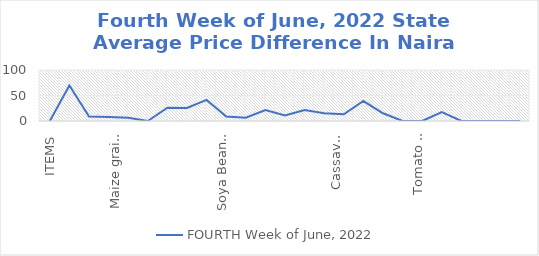
| Category | FOURTH Week of June, 2022 |
|---|---|
| ITEMS | 0 |
| Rice, Imported, High Quality Sold loose  (1 mudu) | 69.565 |
| Rice, Agric Sold Loose(Low quality) imported  (1 mudu) | 8.696 |
| Rice Local, Sold Loose   (1 mudu) | 7.609 |
| Maize grain, white sold loose   (1 mudu) | 6.522 |
| Maize grain, yellow sold loose   (1 mudu) | 0 |
| Sorghum (Guinea Corn) white or brown, sold loose   (1 mudu) | 26.087 |
| millet (jero or maiwa) sold loose   (1 mudu) | 25.652 |
| Beans: white black eye. Sold loose   (1 mudu) | 41.304 |
| Beans Brown, sold loose  (1 mudu) | 8.696 |
| Soya Beans, sold loose    (1 mudu) | 6.522 |
| Gari White, sold loose  (1 mudu) | 21.522 |
| Gari Yellow, sold loose   (1 mudu) | 10.87 |
| Palm oil (1 schnap bottle) | 21.739 |
| Yam tuber (1 Medium Size) | 15.217 |
| Cassava tuber | 13.043 |
| Irish potato  (4 Litre rubber) | 39.13 |
| Sweet potato  (5 Medium Size) | 15.217 |
| Local live chicken  | 0 |
| Groundnut - shelled (fresh) | 0 |
| Tomato fresh   (4 Litre rubber) | 17.391 |
| Okro fresh     (1 mudu) | 0 |
| Okro dried    (1 mudu) | 0 |
| Onion   (4 Litre rubber) | 0 |
| Pepper fresh   (4 Litre rubber) | 0 |